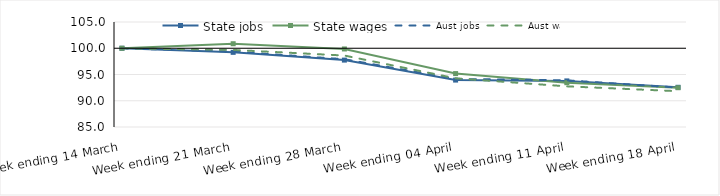
| Category | State jobs | State wages | Aust jobs | Aust wages |
|---|---|---|---|---|
| 2020-03-14 | 100 | 100 | 100 | 100 |
| 2020-03-21 | 99.219 | 100.861 | 99.358 | 99.683 |
| 2020-03-28 | 97.742 | 99.865 | 97.912 | 98.613 |
| 2020-04-04 | 93.938 | 95.173 | 94.152 | 94.278 |
| 2020-04-11 | 93.779 | 93.44 | 93.892 | 92.743 |
| 2020-04-18 | 92.562 | 92.484 | 92.512 | 91.82 |